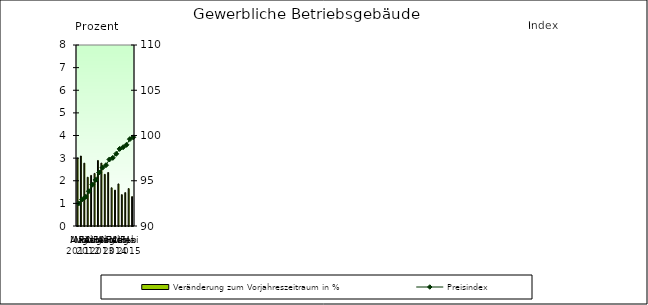
| Category | Veränderung zum Vorjahreszeitraum in % |
|---|---|
| 0 | 3.006 |
| 1 | 3.094 |
| 2 | 2.778 |
| 3 | 2.155 |
| 4 | 2.237 |
| 5 | 2.323 |
| 6 | 2.896 |
| 7 | 2.78 |
| 8 | 2.284 |
| 9 | 2.365 |
| 10 | 1.689 |
| 11 | 1.586 |
| 12 | 1.86 |
| 13 | 1.386 |
| 14 | 1.476 |
| 15 | 1.653 |
| 16 | 1.299 |